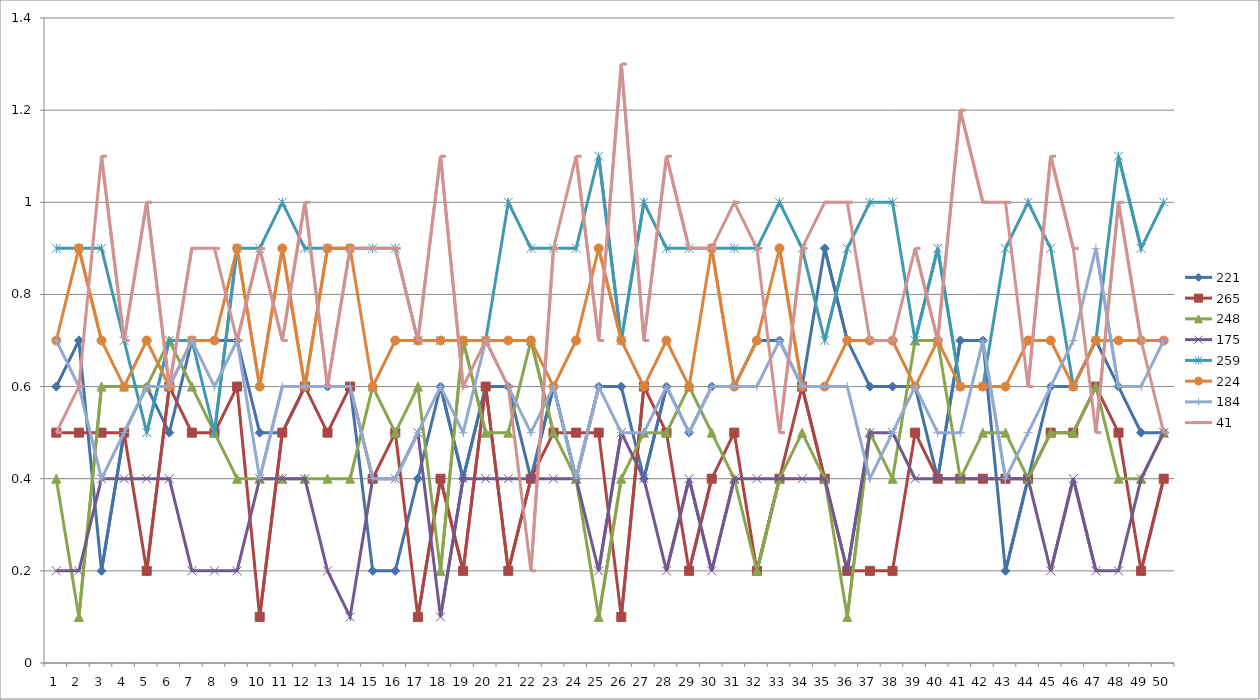
| Category | 221 | 265 | 248 | 175 | 259 | 224 | 184 | 41 |
|---|---|---|---|---|---|---|---|---|
| 0 | 0.6 | 0.5 | 0.4 | 0.2 | 0.9 | 0.7 | 0.7 | 0.5 |
| 1 | 0.7 | 0.5 | 0.1 | 0.2 | 0.9 | 0.9 | 0.6 | 0.6 |
| 2 | 0.2 | 0.5 | 0.6 | 0.4 | 0.9 | 0.7 | 0.4 | 1.1 |
| 3 | 0.5 | 0.5 | 0.6 | 0.4 | 0.7 | 0.6 | 0.5 | 0.7 |
| 4 | 0.6 | 0.2 | 0.6 | 0.4 | 0.5 | 0.7 | 0.6 | 1 |
| 5 | 0.5 | 0.6 | 0.7 | 0.4 | 0.7 | 0.6 | 0.6 | 0.6 |
| 6 | 0.7 | 0.5 | 0.6 | 0.2 | 0.7 | 0.7 | 0.7 | 0.9 |
| 7 | 0.7 | 0.5 | 0.5 | 0.2 | 0.5 | 0.7 | 0.6 | 0.9 |
| 8 | 0.7 | 0.6 | 0.4 | 0.2 | 0.9 | 0.9 | 0.7 | 0.7 |
| 9 | 0.5 | 0.1 | 0.4 | 0.4 | 0.9 | 0.6 | 0.4 | 0.9 |
| 10 | 0.5 | 0.5 | 0.4 | 0.4 | 1 | 0.9 | 0.6 | 0.7 |
| 11 | 0.6 | 0.6 | 0.4 | 0.4 | 0.9 | 0.6 | 0.6 | 1 |
| 12 | 0.6 | 0.5 | 0.4 | 0.2 | 0.9 | 0.9 | 0.6 | 0.6 |
| 13 | 0.6 | 0.6 | 0.4 | 0.1 | 0.9 | 0.9 | 0.6 | 0.9 |
| 14 | 0.2 | 0.4 | 0.6 | 0.4 | 0.9 | 0.6 | 0.4 | 0.9 |
| 15 | 0.2 | 0.5 | 0.5 | 0.4 | 0.9 | 0.7 | 0.4 | 0.9 |
| 16 | 0.4 | 0.1 | 0.6 | 0.5 | 0.7 | 0.7 | 0.5 | 0.7 |
| 17 | 0.6 | 0.4 | 0.2 | 0.1 | 0.7 | 0.7 | 0.6 | 1.1 |
| 18 | 0.4 | 0.2 | 0.7 | 0.4 | 0.7 | 0.7 | 0.5 | 0.6 |
| 19 | 0.6 | 0.6 | 0.5 | 0.4 | 0.7 | 0.7 | 0.7 | 0.7 |
| 20 | 0.6 | 0.2 | 0.5 | 0.4 | 1 | 0.7 | 0.6 | 0.6 |
| 21 | 0.4 | 0.4 | 0.7 | 0.4 | 0.9 | 0.7 | 0.5 | 0.2 |
| 22 | 0.6 | 0.5 | 0.5 | 0.4 | 0.9 | 0.6 | 0.6 | 0.9 |
| 23 | 0.4 | 0.5 | 0.4 | 0.4 | 0.9 | 0.7 | 0.4 | 1.1 |
| 24 | 0.6 | 0.5 | 0.1 | 0.2 | 1.1 | 0.9 | 0.6 | 0.7 |
| 25 | 0.6 | 0.1 | 0.4 | 0.5 | 0.7 | 0.7 | 0.5 | 1.3 |
| 26 | 0.4 | 0.6 | 0.5 | 0.4 | 1 | 0.6 | 0.5 | 0.7 |
| 27 | 0.6 | 0.5 | 0.5 | 0.2 | 0.9 | 0.7 | 0.6 | 1.1 |
| 28 | 0.5 | 0.2 | 0.6 | 0.4 | 0.9 | 0.6 | 0.5 | 0.9 |
| 29 | 0.6 | 0.4 | 0.5 | 0.2 | 0.9 | 0.9 | 0.6 | 0.9 |
| 30 | 0.6 | 0.5 | 0.4 | 0.4 | 0.9 | 0.6 | 0.6 | 1 |
| 31 | 0.7 | 0.2 | 0.2 | 0.4 | 0.9 | 0.7 | 0.6 | 0.9 |
| 32 | 0.7 | 0.4 | 0.4 | 0.4 | 1 | 0.9 | 0.7 | 0.5 |
| 33 | 0.6 | 0.6 | 0.5 | 0.4 | 0.9 | 0.6 | 0.6 | 0.9 |
| 34 | 0.9 | 0.4 | 0.4 | 0.4 | 0.7 | 0.6 | 0.6 | 1 |
| 35 | 0.7 | 0.2 | 0.1 | 0.2 | 0.9 | 0.7 | 0.6 | 1 |
| 36 | 0.6 | 0.2 | 0.5 | 0.5 | 1 | 0.7 | 0.4 | 0.7 |
| 37 | 0.6 | 0.2 | 0.4 | 0.5 | 1 | 0.7 | 0.5 | 0.7 |
| 38 | 0.6 | 0.5 | 0.7 | 0.4 | 0.7 | 0.6 | 0.6 | 0.9 |
| 39 | 0.4 | 0.4 | 0.7 | 0.4 | 0.9 | 0.7 | 0.5 | 0.7 |
| 40 | 0.7 | 0.4 | 0.4 | 0.4 | 0.6 | 0.6 | 0.5 | 1.2 |
| 41 | 0.7 | 0.4 | 0.5 | 0.4 | 0.6 | 0.6 | 0.7 | 1 |
| 42 | 0.2 | 0.4 | 0.5 | 0.4 | 0.9 | 0.6 | 0.4 | 1 |
| 43 | 0.4 | 0.4 | 0.4 | 0.4 | 1 | 0.7 | 0.5 | 0.6 |
| 44 | 0.6 | 0.5 | 0.5 | 0.2 | 0.9 | 0.7 | 0.6 | 1.1 |
| 45 | 0.6 | 0.5 | 0.5 | 0.4 | 0.6 | 0.6 | 0.7 | 0.9 |
| 46 | 0.7 | 0.6 | 0.6 | 0.2 | 0.7 | 0.7 | 0.9 | 0.5 |
| 47 | 0.6 | 0.5 | 0.4 | 0.2 | 1.1 | 0.7 | 0.6 | 1 |
| 48 | 0.5 | 0.2 | 0.4 | 0.4 | 0.9 | 0.7 | 0.6 | 0.7 |
| 49 | 0.5 | 0.4 | 0.5 | 0.5 | 1 | 0.7 | 0.7 | 0.5 |